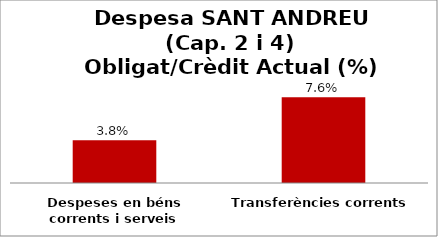
| Category | Series 0 |
|---|---|
| Despeses en béns corrents i serveis | 0.038 |
| Transferències corrents | 0.076 |